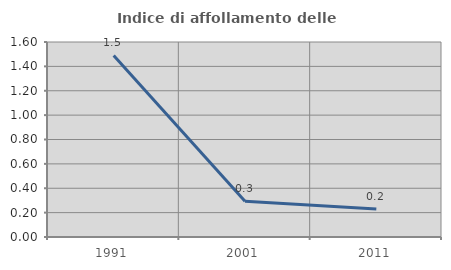
| Category | Indice di affollamento delle abitazioni  |
|---|---|
| 1991.0 | 1.489 |
| 2001.0 | 0.294 |
| 2011.0 | 0.23 |